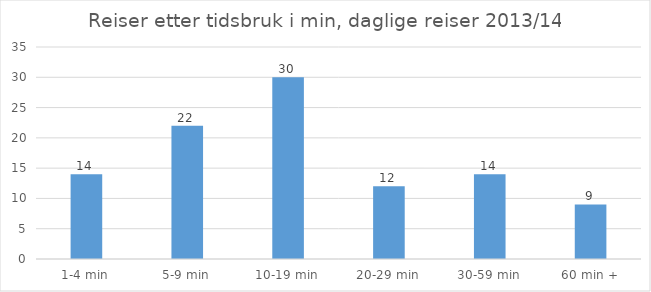
| Category | Andel reiser (i %) |
|---|---|
| 1-4 min | 14 |
| 5-9 min | 22 |
| 10-19 min | 30 |
| 20-29 min | 12 |
| 30-59 min | 14 |
| 60 min + | 9 |